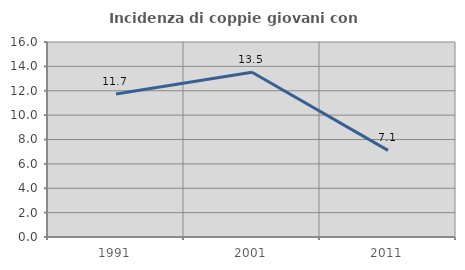
| Category | Incidenza di coppie giovani con figli |
|---|---|
| 1991.0 | 11.728 |
| 2001.0 | 13.514 |
| 2011.0 | 7.104 |